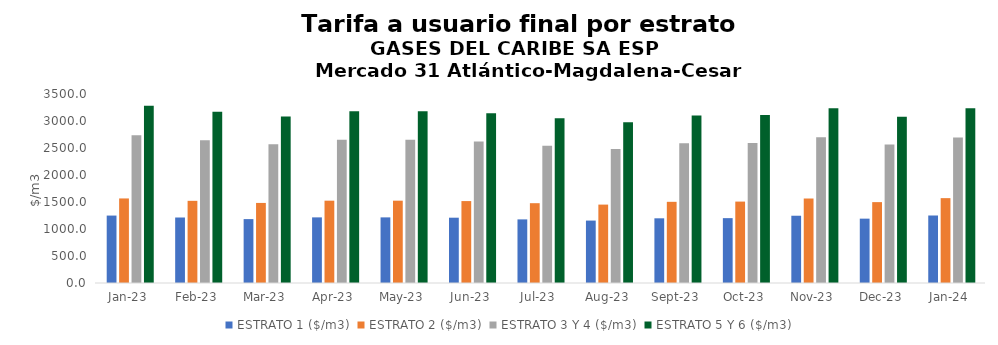
| Category | ESTRATO 1 ($/m3) | ESTRATO 2 ($/m3) | ESTRATO 3 Y 4 ($/m3) | ESTRATO 5 Y 6 ($/m3) |
|---|---|---|---|---|
| 2023-01-01 | 1248.7 | 1565.89 | 2736.03 | 3283.236 |
| 2023-02-01 | 1212.89 | 1521.57 | 2641.83 | 3170.196 |
| 2023-03-01 | 1183.19 | 1482.78 | 2568.94 | 3082.728 |
| 2023-04-01 | 1215.25 | 1524.46 | 2651.33 | 3181.596 |
| 2023-05-01 | 1215.25 | 1524.46 | 2651.33 | 3181.596 |
| 2023-06-01 | 1209.41 | 1517.12 | 2619.03 | 3142.836 |
| 2023-07-01 | 1178 | 1477.97 | 2542.18 | 3050.616 |
| 2023-08-01 | 1155.93 | 1451.92 | 2479.28 | 2975.136 |
| 2023-09-01 | 1198 | 1503.27 | 2586.8 | 3104.16 |
| 2023-10-01 | 1201.13 | 1507.69 | 2594.42 | 3113.304 |
| 2023-11-01 | 1245.69 | 1564.66 | 2697.24 | 3236.688 |
| 2023-12-01 | 1191.7 | 1497.74 | 2567.03 | 3080.436 |
| 2024-01-01 | 1250.09 | 1571.48 | 2695.95 | 3235.14 |